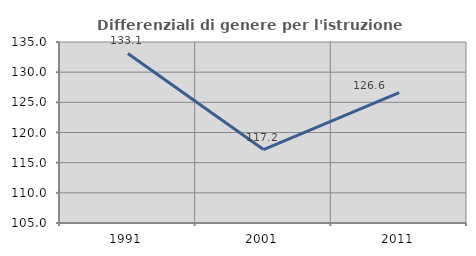
| Category | Differenziali di genere per l'istruzione superiore |
|---|---|
| 1991.0 | 133.1 |
| 2001.0 | 117.17 |
| 2011.0 | 126.606 |